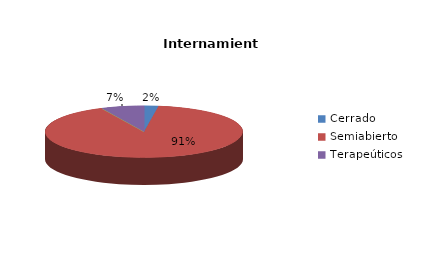
| Category | Series 0 |
|---|---|
| Cerrado | 1 |
| Semiabierto | 39 |
| Abierto | 0 |
| Terapeúticos | 3 |